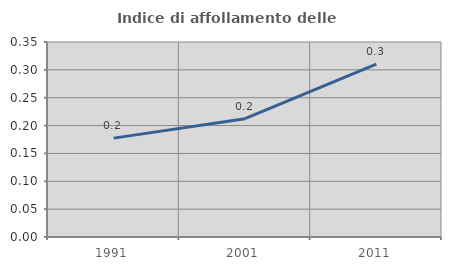
| Category | Indice di affollamento delle abitazioni  |
|---|---|
| 1991.0 | 0.177 |
| 2001.0 | 0.212 |
| 2011.0 | 0.31 |